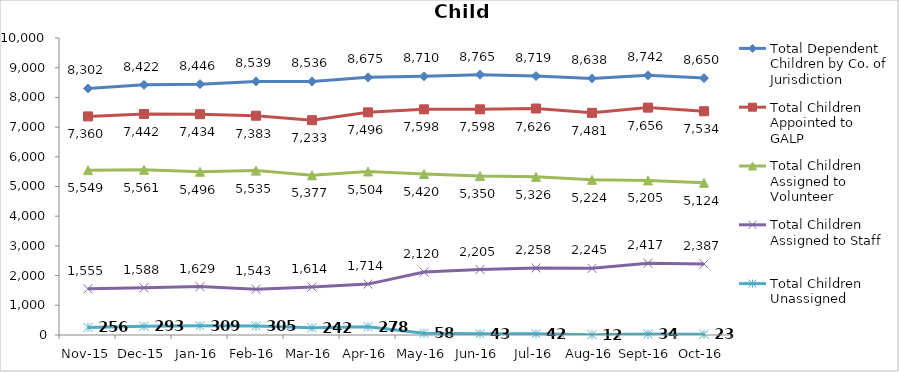
| Category | Total Dependent Children by Co. of Jurisdiction | Total Children Appointed to GALP | Total Children Assigned to Volunteer | Total Children Assigned to Staff | Total Children Unassigned |
|---|---|---|---|---|---|
| Nov-15 | 8302 | 7360 | 5549 | 1555 | 256 |
| Dec-15 | 8422 | 7442 | 5561 | 1588 | 293 |
| Jan-16 | 8446 | 7434 | 5496 | 1629 | 309 |
| Feb-16 | 8539 | 7383 | 5535 | 1543 | 305 |
| Mar-16 | 8536 | 7233 | 5377 | 1614 | 242 |
| Apr-16 | 8675 | 7496 | 5504 | 1714 | 278 |
| May-16 | 8710 | 7598 | 5420 | 2120 | 58 |
| Jun-16 | 8765 | 7598 | 5350 | 2205 | 43 |
| Jul-16 | 8719 | 7626 | 5326 | 2258 | 42 |
| Aug-16 | 8638 | 7481 | 5224 | 2245 | 12 |
| Sep-16 | 8742 | 7656 | 5205 | 2417 | 34 |
| Oct-16 | 8650 | 7534 | 5124 | 2387 | 23 |